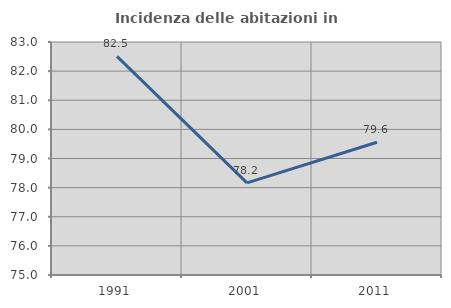
| Category | Incidenza delle abitazioni in proprietà  |
|---|---|
| 1991.0 | 82.507 |
| 2001.0 | 78.161 |
| 2011.0 | 79.56 |